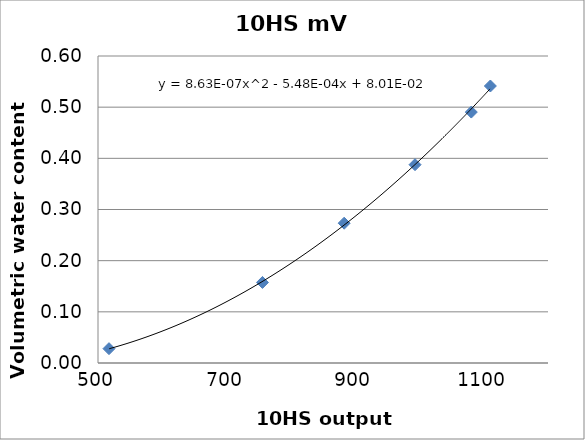
| Category | Series 0 |
|---|---|
| 517.08984375 | 0.028 |
| 755.859375 | 0.157 |
| 882.9345703125 | 0.273 |
| 993.1640625 | 0.388 |
| 1080.6884765625 | 0.49 |
| 1110.3515625 | 0.541 |